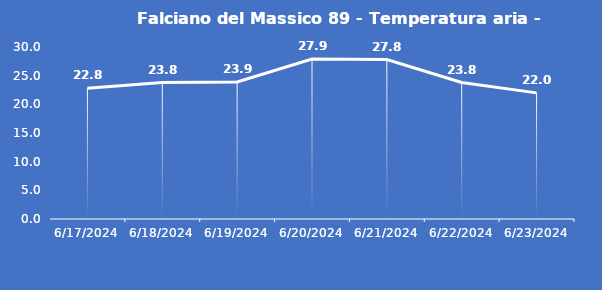
| Category | Falciano del Massico 89 - Temperatura aria - Grezzo (°C) |
|---|---|
| 6/17/24 | 22.8 |
| 6/18/24 | 23.8 |
| 6/19/24 | 23.9 |
| 6/20/24 | 27.9 |
| 6/21/24 | 27.8 |
| 6/22/24 | 23.8 |
| 6/23/24 | 22 |